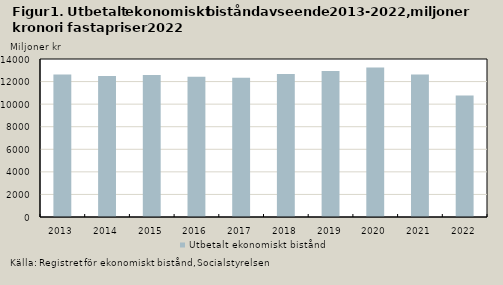
| Category | Utbetalt ekonomiskt bistånd |
|---|---|
| 2013.0 | 12628.367 |
| 2014.0 | 12483.029 |
| 2015.0 | 12571.381 |
| 2016.0 | 12427.722 |
| 2017.0 | 12344.307 |
| 2018.0 | 12663.529 |
| 2019.0 | 12943.09 |
| 2020.0 | 13239.747 |
| 2021.0 | 12625.702 |
| 2022.0 | 10765.475 |